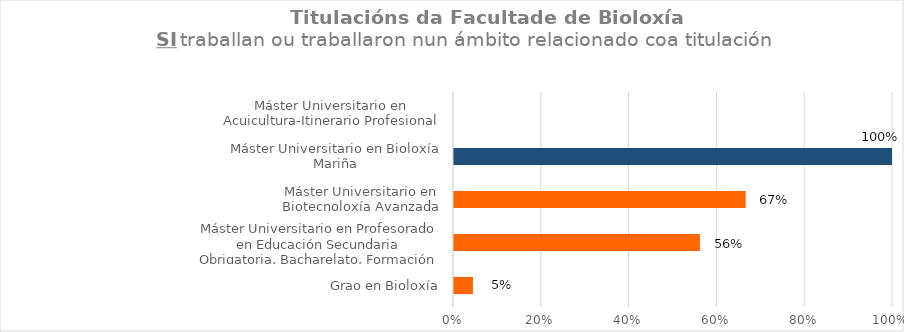
| Category | Series 1 |
|---|---|
| Grao en Bioloxía | 0.045 |
| Máster Universitario en Profesorado en Educación Secundaria Obrigatoria, Bacharelato, Formación Profesional e Ensino de Idiomas.  | 0.562 |
| Máster Universitario en Biotecnoloxía Avanzada | 0.667 |
| Máster Universitario en Bioloxía Mariña | 1 |
| Máster Universitario en Acuicultura-Itinerario Profesional | 0 |